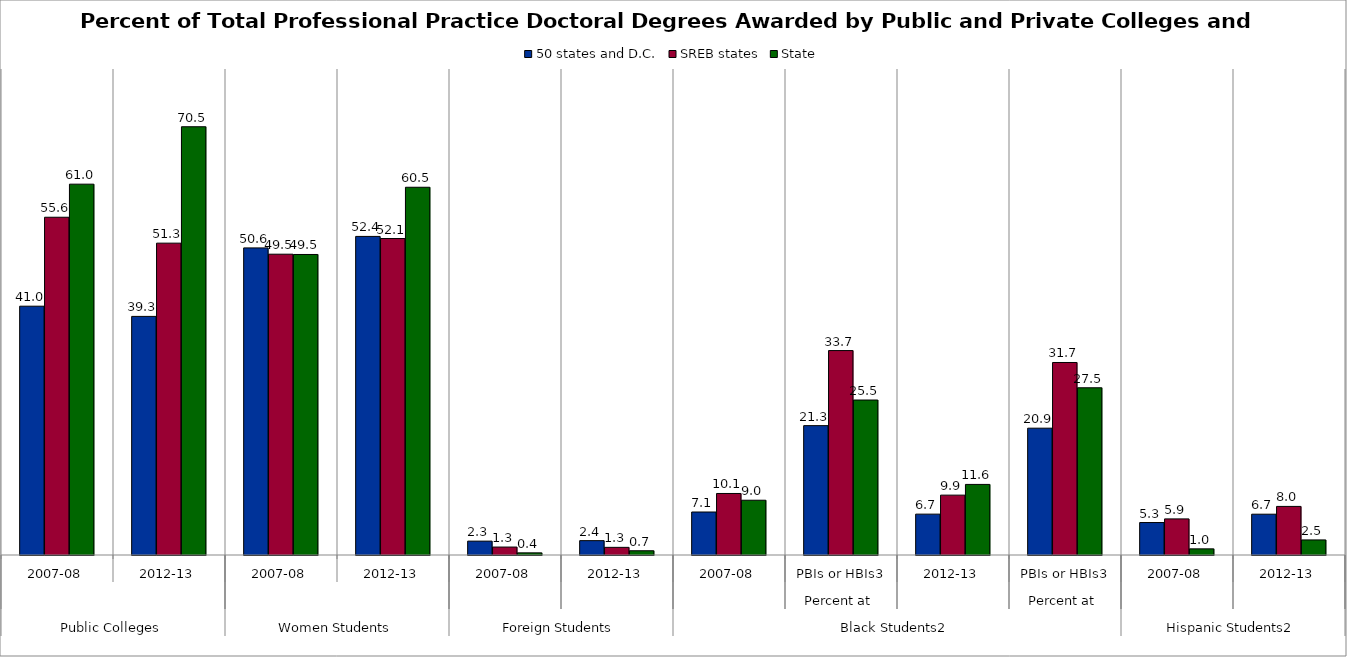
| Category | 50 states and D.C. | SREB states | State |
|---|---|---|---|
| 0 | 40.957 | 55.598 | 61.042 |
| 1 | 39.275 | 51.333 | 70.495 |
| 2 | 50.551 | 49.515 | 49.47 |
| 3 | 52.443 | 52.095 | 60.533 |
| 4 | 2.283 | 1.307 | 0.353 |
| 5 | 2.363 | 1.26 | 0.698 |
| 6 | 7.078 | 10.127 | 9.016 |
| 7 | 21.294 | 33.652 | 25.51 |
| 8 | 6.727 | 9.855 | 11.619 |
| 9 | 20.875 | 31.688 | 27.528 |
| 10 | 5.345 | 5.945 | 1.012 |
| 11 | 6.717 | 7.998 | 2.48 |